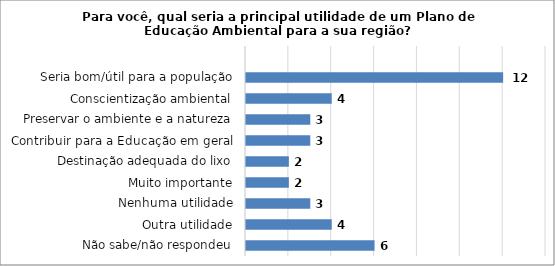
| Category | Series 0 |
|---|---|
| Não sabe/não respondeu | 6 |
| Outra utilidade | 4 |
| Nenhuma utilidade | 3 |
| Muito importante | 2 |
| Destinação adequada do lixo | 2 |
| Contribuir para a Educação em geral | 3 |
| Preservar o ambiente e a natureza | 3 |
| Conscientização ambiental | 4 |
| Seria bom/útil para a população | 12 |